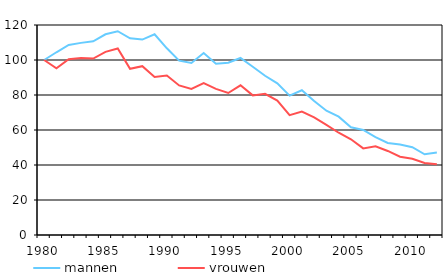
| Category | mannen | vrouwen |
|---|---|---|
| 1980.0 | 100 | 100 |
| 1981.0 | 104.417 | 95.254 |
| 1982.0 | 108.617 | 100.496 |
| 1983.0 | 109.782 | 101.188 |
| 1984.0 | 110.704 | 100.841 |
| 1985.0 | 114.7 | 104.675 |
| 1986.0 | 116.44 | 106.585 |
| 1987.0 | 112.412 | 94.983 |
| 1988.0 | 111.661 | 96.458 |
| 1989.0 | 114.688 | 90.244 |
| 1990.0 | 106.678 | 91.148 |
| 1991.0 | 99.629 | 85.477 |
| 1992.0 | 98.327 | 83.465 |
| 1993.0 | 103.979 | 86.785 |
| 1994.0 | 97.903 | 83.508 |
| 1995.0 | 98.483 | 81.153 |
| 1996.0 | 101.158 | 85.526 |
| 1997.0 | 96.169 | 79.773 |
| 1998.0 | 90.991 | 80.679 |
| 1999.0 | 86.658 | 76.83 |
| 2000.0 | 79.635 | 68.498 |
| 2001.0 | 82.703 | 70.556 |
| 2002.0 | 76.557 | 67.263 |
| 2003.0 | 71.005 | 62.919 |
| 2004.0 | 67.643 | 58.447 |
| 2005.0 | 61.524 | 54.694 |
| 2006.0 | 59.997 | 49.497 |
| 2007.0 | 55.972 | 50.697 |
| 2008.0 | 52.562 | 48.02 |
| 2009.0 | 51.672 | 44.76 |
| 2010.0 | 50.156 | 43.566 |
| 2011.0 | 46.143 | 41.196 |
| 2012.0 | 47.09 | 40.43 |